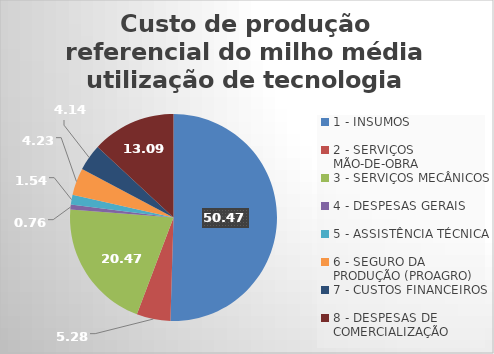
| Category | Series 0 |
|---|---|
| 1 - INSUMOS | 50.475 |
| 2 - SERVIÇOS MÃO-DE-OBRA | 5.285 |
| 3 - SERVIÇOS MECÂNICOS | 20.474 |
| 4 - DESPESAS GERAIS  | 0.762 |
| 5 - ASSISTÊNCIA TÉCNICA | 1.54 |
| 6 - SEGURO DA PRODUÇÃO (PROAGRO) | 4.235 |
| 7 - CUSTOS FINANCEIROS | 4.138 |
| 8 - DESPESAS DE COMERCIALIZAÇÃO | 13.092 |